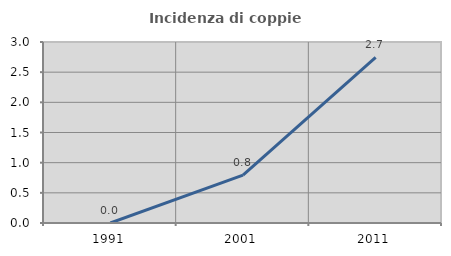
| Category | Incidenza di coppie miste |
|---|---|
| 1991.0 | 0 |
| 2001.0 | 0.794 |
| 2011.0 | 2.745 |